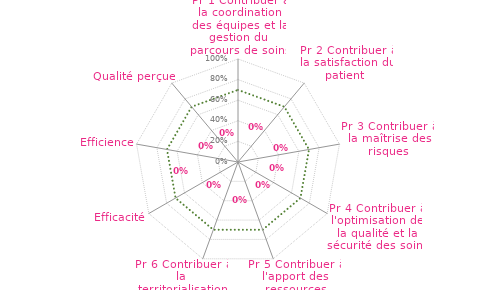
| Category | Seuil 17050 | RADAR pour Preuves Validées "Non Vides" |
|---|---|---|
| Pr 1 Contribuer à la coordination des équipes et la gestion du parcours de soins | 0.7 | 0 |
| Pr 2 Contribuer à la satisfaction du patient  | 0.7 | 0 |
| Pr 3 Contribuer à la maîtrise des risques | 0.7 | 0 |
| Pr 4 Contribuer à l'optimisation de la qualité et la sécurité des soins | 0.7 | 0 |
| Pr 5 Contribuer à l'apport des ressources Humaines | 0.7 | 0 |
| Pr 6 Contribuer à la territorialisation des moyens (GHT) | 0.7 | 0 |
| Efficacité | 0.7 | 0 |
| Efficience | 0.7 | 0 |
| Qualité perçue | 0.7 | 0 |